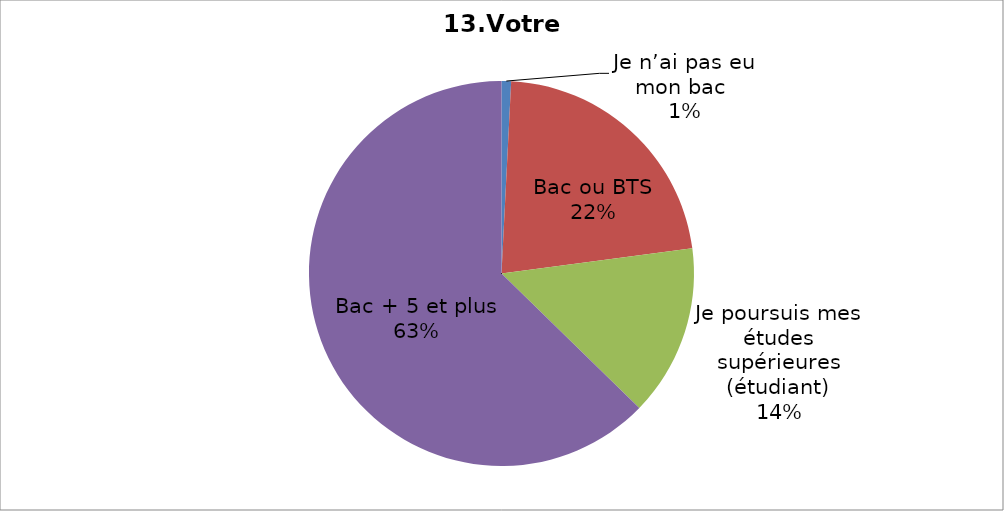
| Category | Series 0 |
|---|---|
| Je n’ai pas eu mon bac  | 0.8 |
| Bac ou BTS | 22.1 |
| Je poursuis mes études supérieures (étudiant) | 14.4 |
| Bac + 5 et plus | 62.7 |